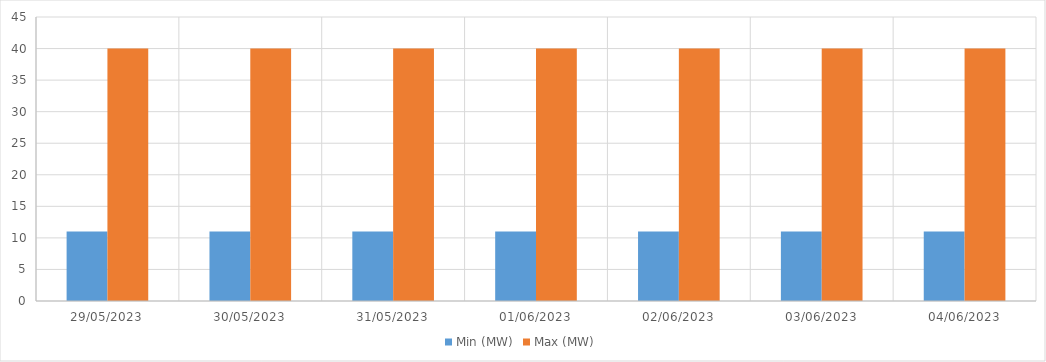
| Category | Min (MW) | Max (MW) |
|---|---|---|
| 29/05/2023 | 11 | 40 |
| 30/05/2023 | 11 | 40 |
| 31/05/2023 | 11 | 40 |
| 01/06/2023 | 11 | 40 |
| 02/06/2023 | 11 | 40 |
| 03/06/2023 | 11 | 40 |
| 04/06/2023 | 11 | 40 |